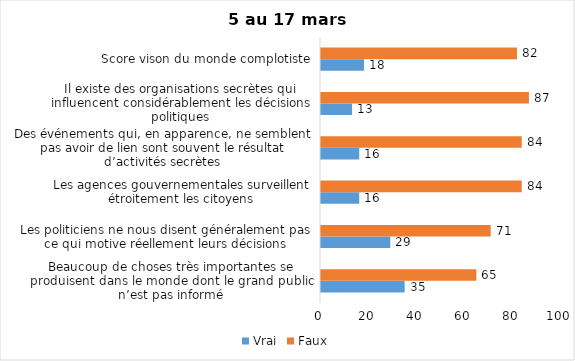
| Category | Vrai | Faux |
|---|---|---|
| Beaucoup de choses très importantes se produisent dans le monde dont le grand public n’est pas informé | 35 | 65 |
| Les politiciens ne nous disent généralement pas ce qui motive réellement leurs décisions | 29 | 71 |
| Les agences gouvernementales surveillent étroitement les citoyens | 16 | 84 |
| Des événements qui, en apparence, ne semblent pas avoir de lien sont souvent le résultat d’activités secrètes | 16 | 84 |
| Il existe des organisations secrètes qui influencent considérablement les décisions politiques | 13 | 87 |
| Score vison du monde complotiste | 18 | 82 |